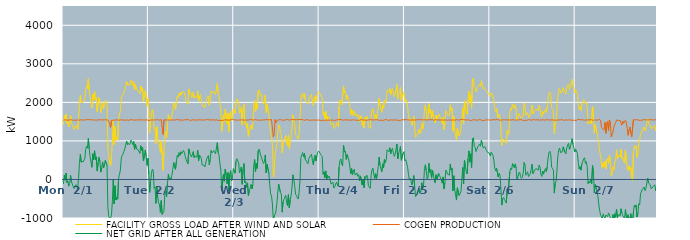
| Category | FACILITY GROSS LOAD AFTER WIND AND SOLAR | COGEN PRODUCTION | NET GRID AFTER ALL GENERATION |
|---|---|---|---|
|  Mon  2/1 | 1423 | 1539 | -116 |
|  Mon  2/1 | 1656 | 1541 | 115 |
|  Mon  2/1 | 1529 | 1548 | -19 |
|  Mon  2/1 | 1698 | 1534 | 164 |
|  Mon  2/1 | 1449 | 1538 | -89 |
|  Mon  2/1 | 1506 | 1548 | -42 |
|  Mon  2/1 | 1362 | 1537 | -175 |
|  Mon  2/1 | 1431 | 1545 | -114 |
|  Mon  2/1 | 1660 | 1553 | 107 |
|  Mon  2/1 | 1482 | 1543 | -61 |
|  Mon  2/1 | 1425 | 1539 | -114 |
|  Mon  2/1 | 1354 | 1541 | -187 |
|  Mon  2/1 | 1300 | 1540 | -240 |
|  Mon  2/1 | 1301 | 1537 | -236 |
|  Mon  2/1 | 1399 | 1534 | -135 |
|  Mon  2/1 | 1354 | 1550 | -196 |
|  Mon  2/1 | 1300 | 1545 | -245 |
|  Mon  2/1 | 1579 | 1550 | 29 |
|  Mon  2/1 | 1955 | 1537 | 418 |
|  Mon  2/1 | 2193 | 1539 | 654 |
|  Mon  2/1 | 1997 | 1550 | 447 |
|  Mon  2/1 | 2011 | 1533 | 478 |
|  Mon  2/1 | 1991 | 1539 | 452 |
|  Mon  2/1 | 1981 | 1546 | 435 |
|  Mon  2/1 | 2083 | 1543 | 540 |
|  Mon  2/1 | 2327 | 1545 | 782 |
|  Mon  2/1 | 2406 | 1551 | 855 |
|  Mon  2/1 | 2356 | 1545 | 811 |
|  Mon  2/1 | 2614 | 1549 | 1065 |
|  Mon  2/1 | 2322 | 1535 | 787 |
|  Mon  2/1 | 2142 | 1554 | 588 |
|  Mon  2/1 | 2133 | 1543 | 590 |
|  Mon  2/1 | 1859 | 1543 | 316 |
|  Mon  2/1 | 2209 | 1542 | 667 |
|  Mon  2/1 | 2059 | 1544 | 515 |
|  Mon  2/1 | 2290 | 1547 | 743 |
|  Mon  2/1 | 2056 | 1541 | 515 |
|  Mon  2/1 | 2131 | 1544 | 587 |
|  Mon  2/1 | 1757 | 1539 | 218 |
|  Mon  2/1 | 1981 | 1550 | 431 |
|  Mon  2/1 | 2125 | 1550 | 575 |
|  Mon  2/1 | 2006 | 1545 | 461 |
|  Mon  2/1 | 1737 | 1547 | 190 |
|  Mon  2/1 | 1839 | 1548 | 291 |
|  Mon  2/1 | 1998 | 1543 | 455 |
|  Mon  2/1 | 1846 | 1548 | 298 |
|  Mon  2/1 | 1910 | 1548 | 362 |
|  Mon  2/1 | 2025 | 1533 | 492 |
|  Mon  2/1 | 2057 | 1546 | 511 |
|  Mon  2/1 | 1897 | 1535 | 362 |
|  Mon  2/1 | 820 | 1544 | -724 |
|  Mon  2/1 | 579 | 1544 | -965 |
|  Mon  2/1 | 422 | 1449 | -1027 |
|  Mon  2/1 | 350 | 1351 | -1001 |
|  Mon  2/1 | 596 | 1529 | -933 |
|  Mon  2/1 | 965 | 1544 | -579 |
|  Mon  2/1 | 1529 | 1539 | -10 |
|  Mon  2/1 | 905 | 1540 | -635 |
|  Mon  2/1 | 1376 | 1537 | -161 |
|  Mon  2/1 | 1016 | 1551 | -535 |
|  Mon  2/1 | 1086 | 1550 | -464 |
|  Mon  2/1 | 1030 | 1543 | -513 |
|  Mon  2/1 | 1564 | 1536 | 28 |
|  Mon  2/1 | 1579 | 1538 | 41 |
|  Mon  2/1 | 1784 | 1546 | 238 |
|  Mon  2/1 | 2079 | 1542 | 537 |
|  Mon  2/1 | 2172 | 1544 | 628 |
|  Mon  2/1 | 2209 | 1548 | 661 |
|  Mon  2/1 | 2263 | 1540 | 723 |
|  Mon  2/1 | 2325 | 1536 | 789 |
|  Mon  2/1 | 2339 | 1537 | 802 |
|  Mon  2/1 | 2542 | 1548 | 994 |
|  Mon  2/1 | 2449 | 1544 | 905 |
|  Mon  2/1 | 2486 | 1544 | 942 |
|  Mon  2/1 | 2433 | 1534 | 899 |
|  Mon  2/1 | 2467 | 1540 | 927 |
|  Mon  2/1 | 2576 | 1555 | 1021 |
|  Mon  2/1 | 2529 | 1561 | 968 |
|  Mon  2/1 | 2445 | 1543 | 902 |
|  Mon  2/1 | 2537 | 1551 | 986 |
|  Mon  2/1 | 2321 | 1539 | 782 |
|  Mon  2/1 | 2461 | 1549 | 912 |
|  Mon  2/1 | 2339 | 1543 | 796 |
|  Mon  2/1 | 2361 | 1543 | 818 |
|  Mon  2/1 | 2317 | 1544 | 773 |
|  Mon  2/1 | 2304 | 1540 | 764 |
|  Mon  2/1 | 2220 | 1547 | 673 |
|  Mon  2/1 | 2426 | 1550 | 876 |
|  Mon  2/1 | 2301 | 1545 | 756 |
|  Mon  2/1 | 2370 | 1542 | 828 |
|  Mon  2/1 | 2022 | 1543 | 479 |
|  Mon  2/1 | 2152 | 1535 | 617 |
|  Mon  2/1 | 2308 | 1542 | 766 |
|  Mon  2/1 | 2137 | 1539 | 598 |
|  Mon  2/1 | 1915 | 1548 | 367 |
|  Mon  2/1 | 2102 | 1554 | 548 |
|  Tue  2/2 | 1662 | 1526 | 136 |
|  Tue  2/2 | 1207 | 1542 | -335 |
|  Tue  2/2 | 1487 | 1540 | -53 |
|  Tue  2/2 | 1704 | 1541 | 163 |
|  Tue  2/2 | 1815 | 1546 | 269 |
|  Tue  2/2 | 1782 | 1549 | 233 |
|  Tue  2/2 | 1309 | 1542 | -233 |
|  Tue  2/2 | 1344 | 1537 | -193 |
|  Tue  2/2 | 924 | 1546 | -622 |
|  Tue  2/2 | 1367 | 1549 | -182 |
|  Tue  2/2 | 1099 | 1551 | -452 |
|  Tue  2/2 | 928 | 1533 | -605 |
|  Tue  2/2 | 897 | 1538 | -641 |
|  Tue  2/2 | 700 | 1551 | -851 |
|  Tue  2/2 | 1004 | 1553 | -549 |
|  Tue  2/2 | 642 | 1550 | -908 |
|  Tue  2/2 | 234 | 1167 | -933 |
|  Tue  2/2 | 722 | 1548 | -826 |
|  Tue  2/2 | 1146 | 1546 | -400 |
|  Tue  2/2 | 1246 | 1542 | -296 |
|  Tue  2/2 | 1089 | 1535 | -446 |
|  Tue  2/2 | 1444 | 1544 | -100 |
|  Tue  2/2 | 1685 | 1548 | 137 |
|  Tue  2/2 | 1544 | 1540 | 4 |
|  Tue  2/2 | 1595 | 1553 | 42 |
|  Tue  2/2 | 1549 | 1545 | 4 |
|  Tue  2/2 | 1664 | 1546 | 118 |
|  Tue  2/2 | 1805 | 1542 | 263 |
|  Tue  2/2 | 1986 | 1550 | 436 |
|  Tue  2/2 | 1959 | 1539 | 420 |
|  Tue  2/2 | 1806 | 1543 | 263 |
|  Tue  2/2 | 2022 | 1553 | 469 |
|  Tue  2/2 | 2166 | 1540 | 626 |
|  Tue  2/2 | 2122 | 1547 | 575 |
|  Tue  2/2 | 2240 | 1546 | 694 |
|  Tue  2/2 | 2166 | 1544 | 622 |
|  Tue  2/2 | 2266 | 1544 | 722 |
|  Tue  2/2 | 2206 | 1539 | 667 |
|  Tue  2/2 | 2196 | 1550 | 646 |
|  Tue  2/2 | 2293 | 1541 | 752 |
|  Tue  2/2 | 2244 | 1544 | 700 |
|  Tue  2/2 | 2149 | 1550 | 599 |
|  Tue  2/2 | 2041 | 1525 | 516 |
|  Tue  2/2 | 2050 | 1550 | 500 |
|  Tue  2/2 | 1952 | 1546 | 406 |
|  Tue  2/2 | 2348 | 1555 | 793 |
|  Tue  2/2 | 2214 | 1529 | 685 |
|  Tue  2/2 | 2254 | 1550 | 704 |
|  Tue  2/2 | 2120 | 1538 | 582 |
|  Tue  2/2 | 2147 | 1540 | 607 |
|  Tue  2/2 | 2269 | 1548 | 721 |
|  Tue  2/2 | 2112 | 1547 | 565 |
|  Tue  2/2 | 2150 | 1541 | 609 |
|  Tue  2/2 | 2144 | 1540 | 604 |
|  Tue  2/2 | 2117 | 1542 | 575 |
|  Tue  2/2 | 2293 | 1537 | 756 |
|  Tue  2/2 | 2033 | 1547 | 486 |
|  Tue  2/2 | 2156 | 1522 | 634 |
|  Tue  2/2 | 2203 | 1547 | 656 |
|  Tue  2/2 | 2092 | 1538 | 554 |
|  Tue  2/2 | 1912 | 1538 | 374 |
|  Tue  2/2 | 1915 | 1544 | 371 |
|  Tue  2/2 | 1911 | 1544 | 367 |
|  Tue  2/2 | 1859 | 1537 | 322 |
|  Tue  2/2 | 1882 | 1545 | 337 |
|  Tue  2/2 | 2077 | 1549 | 528 |
|  Tue  2/2 | 2067 | 1556 | 511 |
|  Tue  2/2 | 2170 | 1549 | 621 |
|  Tue  2/2 | 1922 | 1545 | 377 |
|  Tue  2/2 | 2069 | 1549 | 520 |
|  Tue  2/2 | 2291 | 1541 | 750 |
|  Tue  2/2 | 2244 | 1554 | 690 |
|  Tue  2/2 | 2242 | 1549 | 693 |
|  Tue  2/2 | 2284 | 1537 | 747 |
|  Tue  2/2 | 2239 | 1539 | 700 |
|  Tue  2/2 | 2205 | 1538 | 667 |
|  Tue  2/2 | 2230 | 1548 | 682 |
|  Tue  2/2 | 2494 | 1542 | 952 |
|  Tue  2/2 | 2225 | 1532 | 693 |
|  Tue  2/2 | 2168 | 1538 | 630 |
|  Tue  2/2 | 1942 | 1536 | 406 |
|  Tue  2/2 | 1798 | 1555 | 243 |
|  Tue  2/2 | 1247 | 1530 | -283 |
|  Tue  2/2 | 1260 | 1538 | -278 |
|  Tue  2/2 | 1678 | 1537 | 141 |
|  Tue  2/2 | 1499 | 1545 | -46 |
|  Tue  2/2 | 1820 | 1549 | 271 |
|  Tue  2/2 | 1653 | 1544 | 109 |
|  Tue  2/2 | 1433 | 1544 | -111 |
|  Tue  2/2 | 1720 | 1542 | 178 |
|  Tue  2/2 | 1240 | 1537 | -297 |
|  Tue  2/2 | 1668 | 1536 | 132 |
|  Tue  2/2 | 1771 | 1546 | 225 |
|  Tue  2/2 | 1516 | 1553 | -37 |
|  Tue  2/2 | 1581 | 1560 | 21 |
|  Tue  2/2 | 1822 | 1543 | 279 |
|  Wed  2/3 | 1827 | 1545 | 282 |
|  Wed  2/3 | 1717 | 1553 | 164 |
|  Wed  2/3 | 2010 | 1544 | 466 |
|  Wed  2/3 | 2090 | 1552 | 538 |
|  Wed  2/3 | 2061 | 1537 | 524 |
|  Wed  2/3 | 1977 | 1545 | 432 |
|  Wed  2/3 | 1717 | 1544 | 173 |
|  Wed  2/3 | 1762 | 1550 | 212 |
|  Wed  2/3 | 1872 | 1547 | 325 |
|  Wed  2/3 | 1411 | 1536 | -125 |
|  Wed  2/3 | 1817 | 1544 | 273 |
|  Wed  2/3 | 1959 | 1546 | 413 |
|  Wed  2/3 | 1454 | 1540 | -86 |
|  Wed  2/3 | 1489 | 1544 | -55 |
|  Wed  2/3 | 1336 | 1541 | -205 |
|  Wed  2/3 | 1458 | 1547 | -89 |
|  Wed  2/3 | 1117 | 1541 | -424 |
|  Wed  2/3 | 1244 | 1541 | -297 |
|  Wed  2/3 | 1335 | 1553 | -218 |
|  Wed  2/3 | 1409 | 1541 | -132 |
|  Wed  2/3 | 1303 | 1547 | -244 |
|  Wed  2/3 | 1423 | 1556 | -133 |
|  Wed  2/3 | 1895 | 1540 | 355 |
|  Wed  2/3 | 2054 | 1538 | 516 |
|  Wed  2/3 | 1752 | 1556 | 196 |
|  Wed  2/3 | 1963 | 1548 | 415 |
|  Wed  2/3 | 1826 | 1538 | 288 |
|  Wed  2/3 | 2280 | 1542 | 738 |
|  Wed  2/3 | 2324 | 1538 | 786 |
|  Wed  2/3 | 2347 | 1539 | 808 |
|  Wed  2/3 | 2157 | 1541 | 616 |
|  Wed  2/3 | 2185 | 1552 | 633 |
|  Wed  2/3 | 2016 | 1542 | 474 |
|  Wed  2/3 | 1953 | 1539 | 414 |
|  Wed  2/3 | 2006 | 1547 | 459 |
|  Wed  2/3 | 2186 | 1550 | 636 |
|  Wed  2/3 | 1723 | 1551 | 172 |
|  Wed  2/3 | 1944 | 1550 | 394 |
|  Wed  2/3 | 1948 | 1550 | 398 |
|  Wed  2/3 | 1697 | 1540 | 157 |
|  Wed  2/3 | 1413 | 1546 | -133 |
|  Wed  2/3 | 1163 | 1538 | -375 |
|  Wed  2/3 | 1123 | 1554 | -431 |
|  Wed  2/3 | 903 | 1541 | -638 |
|  Wed  2/3 | 71 | 1107 | -1036 |
|  Wed  2/3 | 232 | 1182 | -950 |
|  Wed  2/3 | 651 | 1553 | -902 |
|  Wed  2/3 | 655 | 1473 | -818 |
|  Wed  2/3 | 907 | 1530 | -623 |
|  Wed  2/3 | 1189 | 1542 | -353 |
|  Wed  2/3 | 1423 | 1543 | -120 |
|  Wed  2/3 | 1394 | 1534 | -140 |
|  Wed  2/3 | 1215 | 1553 | -338 |
|  Wed  2/3 | 1169 | 1547 | -378 |
|  Wed  2/3 | 689 | 1538 | -849 |
|  Wed  2/3 | 966 | 1539 | -573 |
|  Wed  2/3 | 1021 | 1536 | -515 |
|  Wed  2/3 | 1025 | 1531 | -506 |
|  Wed  2/3 | 1136 | 1548 | -412 |
|  Wed  2/3 | 938 | 1538 | -600 |
|  Wed  2/3 | 876 | 1556 | -680 |
|  Wed  2/3 | 1141 | 1535 | -394 |
|  Wed  2/3 | 799 | 1539 | -740 |
|  Wed  2/3 | 1006 | 1539 | -533 |
|  Wed  2/3 | 1138 | 1550 | -412 |
|  Wed  2/3 | 1335 | 1548 | -213 |
|  Wed  2/3 | 1677 | 1556 | 121 |
|  Wed  2/3 | 1573 | 1554 | 19 |
|  Wed  2/3 | 1388 | 1548 | -160 |
|  Wed  2/3 | 1163 | 1540 | -377 |
|  Wed  2/3 | 1134 | 1552 | -418 |
|  Wed  2/3 | 1071 | 1539 | -468 |
|  Wed  2/3 | 1043 | 1551 | -508 |
|  Wed  2/3 | 1204 | 1538 | -334 |
|  Wed  2/3 | 1518 | 1555 | -37 |
|  Wed  2/3 | 2109 | 1542 | 567 |
|  Wed  2/3 | 2190 | 1554 | 636 |
|  Wed  2/3 | 2240 | 1543 | 697 |
|  Wed  2/3 | 2125 | 1543 | 582 |
|  Wed  2/3 | 2230 | 1558 | 672 |
|  Wed  2/3 | 2060 | 1536 | 524 |
|  Wed  2/3 | 2017 | 1540 | 477 |
|  Wed  2/3 | 2034 | 1554 | 480 |
|  Wed  2/3 | 1960 | 1554 | 406 |
|  Wed  2/3 | 2082 | 1537 | 545 |
|  Wed  2/3 | 2132 | 1546 | 586 |
|  Wed  2/3 | 2134 | 1536 | 598 |
|  Wed  2/3 | 2204 | 1551 | 653 |
|  Wed  2/3 | 2029 | 1543 | 486 |
|  Wed  2/3 | 1921 | 1545 | 376 |
|  Wed  2/3 | 2091 | 1541 | 550 |
|  Wed  2/3 | 2169 | 1542 | 627 |
|  Wed  2/3 | 2016 | 1538 | 478 |
|  Wed  2/3 | 2149 | 1537 | 612 |
|  Wed  2/3 | 2248 | 1540 | 708 |
|  Wed  2/3 | 2285 | 1548 | 737 |
|  Thu  2/4 | 2287 | 1541 | 746 |
|  Thu  2/4 | 2208 | 1544 | 664 |
|  Thu  2/4 | 2148 | 1523 | 625 |
|  Thu  2/4 | 2118 | 1521 | 597 |
|  Thu  2/4 | 1676 | 1542 | 134 |
|  Thu  2/4 | 1738 | 1539 | 199 |
|  Thu  2/4 | 1564 | 1519 | 45 |
|  Thu  2/4 | 1767 | 1546 | 221 |
|  Thu  2/4 | 1533 | 1534 | -1 |
|  Thu  2/4 | 1643 | 1533 | 110 |
|  Thu  2/4 | 1598 | 1550 | 48 |
|  Thu  2/4 | 1624 | 1539 | 85 |
|  Thu  2/4 | 1611 | 1539 | 72 |
|  Thu  2/4 | 1418 | 1537 | -119 |
|  Thu  2/4 | 1430 | 1550 | -120 |
|  Thu  2/4 | 1470 | 1541 | -71 |
|  Thu  2/4 | 1321 | 1544 | -223 |
|  Thu  2/4 | 1340 | 1530 | -190 |
|  Thu  2/4 | 1365 | 1545 | -180 |
|  Thu  2/4 | 1473 | 1545 | -72 |
|  Thu  2/4 | 1423 | 1542 | -119 |
|  Thu  2/4 | 1370 | 1548 | -178 |
|  Thu  2/4 | 1887 | 1560 | 327 |
|  Thu  2/4 | 2058 | 1560 | 498 |
|  Thu  2/4 | 2076 | 1544 | 532 |
|  Thu  2/4 | 1933 | 1545 | 388 |
|  Thu  2/4 | 1911 | 1556 | 355 |
|  Thu  2/4 | 2426 | 1542 | 884 |
|  Thu  2/4 | 2257 | 1548 | 709 |
|  Thu  2/4 | 2283 | 1547 | 736 |
|  Thu  2/4 | 2068 | 1550 | 518 |
|  Thu  2/4 | 2186 | 1543 | 643 |
|  Thu  2/4 | 2118 | 1549 | 569 |
|  Thu  2/4 | 2046 | 1544 | 502 |
|  Thu  2/4 | 1898 | 1546 | 352 |
|  Thu  2/4 | 1684 | 1537 | 147 |
|  Thu  2/4 | 1825 | 1544 | 281 |
|  Thu  2/4 | 1662 | 1546 | 116 |
|  Thu  2/4 | 1788 | 1551 | 237 |
|  Thu  2/4 | 1809 | 1544 | 265 |
|  Thu  2/4 | 1652 | 1540 | 112 |
|  Thu  2/4 | 1629 | 1539 | 90 |
|  Thu  2/4 | 1705 | 1537 | 168 |
|  Thu  2/4 | 1614 | 1532 | 82 |
|  Thu  2/4 | 1669 | 1546 | 123 |
|  Thu  2/4 | 1505 | 1536 | -31 |
|  Thu  2/4 | 1630 | 1538 | 92 |
|  Thu  2/4 | 1662 | 1556 | 106 |
|  Thu  2/4 | 1404 | 1549 | -145 |
|  Thu  2/4 | 1550 | 1539 | 11 |
|  Thu  2/4 | 1334 | 1544 | -210 |
|  Thu  2/4 | 1620 | 1543 | 77 |
|  Thu  2/4 | 1564 | 1532 | 32 |
|  Thu  2/4 | 1648 | 1534 | 114 |
|  Thu  2/4 | 1589 | 1533 | 56 |
|  Thu  2/4 | 1380 | 1543 | -163 |
|  Thu  2/4 | 1358 | 1536 | -178 |
|  Thu  2/4 | 1321 | 1552 | -231 |
|  Thu  2/4 | 1655 | 1545 | 110 |
|  Thu  2/4 | 1793 | 1545 | 248 |
|  Thu  2/4 | 1841 | 1544 | 297 |
|  Thu  2/4 | 1681 | 1542 | 139 |
|  Thu  2/4 | 1571 | 1544 | 27 |
|  Thu  2/4 | 1699 | 1551 | 148 |
|  Thu  2/4 | 1556 | 1539 | 17 |
|  Thu  2/4 | 1702 | 1550 | 152 |
|  Thu  2/4 | 1878 | 1551 | 327 |
|  Thu  2/4 | 2112 | 1532 | 580 |
|  Thu  2/4 | 1911 | 1540 | 371 |
|  Thu  2/4 | 1903 | 1541 | 362 |
|  Thu  2/4 | 1743 | 1545 | 198 |
|  Thu  2/4 | 1933 | 1529 | 404 |
|  Thu  2/4 | 1850 | 1543 | 307 |
|  Thu  2/4 | 2063 | 1546 | 517 |
|  Thu  2/4 | 1986 | 1548 | 438 |
|  Thu  2/4 | 2063 | 1556 | 507 |
|  Thu  2/4 | 2310 | 1541 | 769 |
|  Thu  2/4 | 2317 | 1533 | 784 |
|  Thu  2/4 | 2262 | 1541 | 721 |
|  Thu  2/4 | 2363 | 1542 | 821 |
|  Thu  2/4 | 2200 | 1535 | 665 |
|  Thu  2/4 | 2309 | 1545 | 764 |
|  Thu  2/4 | 2358 | 1552 | 806 |
|  Thu  2/4 | 2241 | 1542 | 699 |
|  Thu  2/4 | 2150 | 1550 | 600 |
|  Thu  2/4 | 2181 | 1542 | 639 |
|  Thu  2/4 | 2329 | 1548 | 781 |
|  Thu  2/4 | 2463 | 1542 | 921 |
|  Thu  2/4 | 2082 | 1546 | 536 |
|  Thu  2/4 | 2219 | 1532 | 687 |
|  Thu  2/4 | 2295 | 1538 | 757 |
|  Thu  2/4 | 2388 | 1532 | 856 |
|  Thu  2/4 | 2049 | 1551 | 498 |
|  Thu  2/4 | 2031 | 1552 | 479 |
|  Thu  2/4 | 2227 | 1548 | 679 |
|  Thu  2/4 | 2266 | 1544 | 722 |
|  Fri  2/5 | 2017 | 1537 | 480 |
|  Fri  2/5 | 2072 | 1558 | 514 |
|  Fri  2/5 | 2040 | 1535 | 505 |
|  Fri  2/5 | 1873 | 1543 | 330 |
|  Fri  2/5 | 1679 | 1543 | 136 |
|  Fri  2/5 | 1527 | 1542 | -15 |
|  Fri  2/5 | 1579 | 1553 | 26 |
|  Fri  2/5 | 1487 | 1541 | -54 |
|  Fri  2/5 | 1405 | 1544 | -139 |
|  Fri  2/5 | 1540 | 1544 | -4 |
|  Fri  2/5 | 1643 | 1542 | 101 |
|  Fri  2/5 | 1350 | 1541 | -191 |
|  Fri  2/5 | 1089 | 1534 | -445 |
|  Fri  2/5 | 1087 | 1546 | -459 |
|  Fri  2/5 | 1166 | 1544 | -378 |
|  Fri  2/5 | 1182 | 1551 | -369 |
|  Fri  2/5 | 1305 | 1542 | -237 |
|  Fri  2/5 | 1189 | 1550 | -361 |
|  Fri  2/5 | 1257 | 1551 | -294 |
|  Fri  2/5 | 1465 | 1549 | -84 |
|  Fri  2/5 | 1306 | 1543 | -237 |
|  Fri  2/5 | 1398 | 1546 | -148 |
|  Fri  2/5 | 1852 | 1570 | 282 |
|  Fri  2/5 | 1929 | 1549 | 380 |
|  Fri  2/5 | 1783 | 1554 | 229 |
|  Fri  2/5 | 1551 | 1540 | 11 |
|  Fri  2/5 | 1590 | 1536 | 54 |
|  Fri  2/5 | 1971 | 1551 | 420 |
|  Fri  2/5 | 1726 | 1540 | 186 |
|  Fri  2/5 | 1809 | 1548 | 261 |
|  Fri  2/5 | 1579 | 1543 | 36 |
|  Fri  2/5 | 1798 | 1557 | 241 |
|  Fri  2/5 | 1643 | 1530 | 113 |
|  Fri  2/5 | 1539 | 1545 | -6 |
|  Fri  2/5 | 1465 | 1552 | -87 |
|  Fri  2/5 | 1666 | 1543 | 123 |
|  Fri  2/5 | 1549 | 1546 | 3 |
|  Fri  2/5 | 1526 | 1545 | -19 |
|  Fri  2/5 | 1700 | 1543 | 157 |
|  Fri  2/5 | 1646 | 1545 | 101 |
|  Fri  2/5 | 1634 | 1542 | 92 |
|  Fri  2/5 | 1540 | 1555 | -15 |
|  Fri  2/5 | 1448 | 1545 | -97 |
|  Fri  2/5 | 1611 | 1545 | 66 |
|  Fri  2/5 | 1293 | 1538 | -245 |
|  Fri  2/5 | 1460 | 1544 | -84 |
|  Fri  2/5 | 1791 | 1546 | 245 |
|  Fri  2/5 | 1747 | 1542 | 205 |
|  Fri  2/5 | 1669 | 1533 | 136 |
|  Fri  2/5 | 1677 | 1549 | 128 |
|  Fri  2/5 | 1657 | 1544 | 113 |
|  Fri  2/5 | 1943 | 1541 | 402 |
|  Fri  2/5 | 1779 | 1539 | 240 |
|  Fri  2/5 | 1844 | 1556 | 288 |
|  Fri  2/5 | 1252 | 1546 | -294 |
|  Fri  2/5 | 1632 | 1536 | 96 |
|  Fri  2/5 | 1271 | 1535 | -264 |
|  Fri  2/5 | 1136 | 1546 | -410 |
|  Fri  2/5 | 1020 | 1555 | -535 |
|  Fri  2/5 | 1330 | 1546 | -216 |
|  Fri  2/5 | 1327 | 1538 | -211 |
|  Fri  2/5 | 1133 | 1549 | -416 |
|  Fri  2/5 | 1182 | 1549 | -367 |
|  Fri  2/5 | 1202 | 1526 | -324 |
|  Fri  2/5 | 1531 | 1558 | -27 |
|  Fri  2/5 | 1858 | 1547 | 311 |
|  Fri  2/5 | 1441 | 1557 | -116 |
|  Fri  2/5 | 2043 | 1546 | 497 |
|  Fri  2/5 | 1887 | 1542 | 345 |
|  Fri  2/5 | 1750 | 1544 | 206 |
|  Fri  2/5 | 1690 | 1546 | 144 |
|  Fri  2/5 | 2080 | 1535 | 545 |
|  Fri  2/5 | 2287 | 1545 | 742 |
|  Fri  2/5 | 2003 | 1553 | 450 |
|  Fri  2/5 | 2188 | 1522 | 666 |
|  Fri  2/5 | 1850 | 1540 | 310 |
|  Fri  2/5 | 2598 | 1545 | 1053 |
|  Fri  2/5 | 2626 | 1543 | 1083 |
|  Fri  2/5 | 2410 | 1548 | 862 |
|  Fri  2/5 | 2372 | 1542 | 830 |
|  Fri  2/5 | 2267 | 1541 | 726 |
|  Fri  2/5 | 2290 | 1546 | 744 |
|  Fri  2/5 | 2391 | 1538 | 853 |
|  Fri  2/5 | 2391 | 1549 | 842 |
|  Fri  2/5 | 2467 | 1553 | 914 |
|  Fri  2/5 | 2411 | 1548 | 863 |
|  Fri  2/5 | 2559 | 1541 | 1018 |
|  Fri  2/5 | 2443 | 1538 | 905 |
|  Fri  2/5 | 2349 | 1526 | 823 |
|  Fri  2/5 | 2382 | 1551 | 831 |
|  Fri  2/5 | 2389 | 1540 | 849 |
|  Fri  2/5 | 2319 | 1533 | 786 |
|  Fri  2/5 | 2291 | 1545 | 746 |
|  Fri  2/5 | 2234 | 1533 | 701 |
|  Fri  2/5 | 2226 | 1547 | 679 |
|  Fri  2/5 | 2218 | 1536 | 682 |
|  Sat  2/6 | 2145 | 1536 | 609 |
|  Sat  2/6 | 2249 | 1539 | 710 |
|  Sat  2/6 | 2257 | 1548 | 709 |
|  Sat  2/6 | 2174 | 1548 | 626 |
|  Sat  2/6 | 2052 | 1550 | 502 |
|  Sat  2/6 | 1844 | 1543 | 301 |
|  Sat  2/6 | 1767 | 1546 | 221 |
|  Sat  2/6 | 1841 | 1546 | 295 |
|  Sat  2/6 | 1863 | 1556 | 307 |
|  Sat  2/6 | 1597 | 1535 | 62 |
|  Sat  2/6 | 1693 | 1540 | 153 |
|  Sat  2/6 | 1633 | 1533 | 100 |
|  Sat  2/6 | 1284 | 1538 | -254 |
|  Sat  2/6 | 883 | 1548 | -665 |
|  Sat  2/6 | 1048 | 1547 | -499 |
|  Sat  2/6 | 1067 | 1535 | -468 |
|  Sat  2/6 | 1024 | 1546 | -522 |
|  Sat  2/6 | 976 | 1539 | -563 |
|  Sat  2/6 | 936 | 1547 | -611 |
|  Sat  2/6 | 1281 | 1543 | -262 |
|  Sat  2/6 | 1162 | 1542 | -380 |
|  Sat  2/6 | 1190 | 1550 | -360 |
|  Sat  2/6 | 1748 | 1544 | 204 |
|  Sat  2/6 | 1848 | 1556 | 292 |
|  Sat  2/6 | 1795 | 1540 | 255 |
|  Sat  2/6 | 1959 | 1548 | 411 |
|  Sat  2/6 | 1903 | 1554 | 349 |
|  Sat  2/6 | 1849 | 1545 | 304 |
|  Sat  2/6 | 1938 | 1535 | 403 |
|  Sat  2/6 | 1834 | 1531 | 303 |
|  Sat  2/6 | 1530 | 1544 | -14 |
|  Sat  2/6 | 1611 | 1550 | 61 |
|  Sat  2/6 | 1708 | 1543 | 165 |
|  Sat  2/6 | 1723 | 1531 | 192 |
|  Sat  2/6 | 1630 | 1551 | 79 |
|  Sat  2/6 | 1581 | 1549 | 32 |
|  Sat  2/6 | 1614 | 1551 | 63 |
|  Sat  2/6 | 1685 | 1522 | 163 |
|  Sat  2/6 | 1985 | 1545 | 440 |
|  Sat  2/6 | 1916 | 1534 | 382 |
|  Sat  2/6 | 1663 | 1553 | 110 |
|  Sat  2/6 | 1681 | 1535 | 146 |
|  Sat  2/6 | 1741 | 1542 | 199 |
|  Sat  2/6 | 1625 | 1549 | 76 |
|  Sat  2/6 | 1598 | 1542 | 56 |
|  Sat  2/6 | 1693 | 1544 | 149 |
|  Sat  2/6 | 1809 | 1546 | 263 |
|  Sat  2/6 | 1931 | 1538 | 393 |
|  Sat  2/6 | 1697 | 1545 | 152 |
|  Sat  2/6 | 1701 | 1557 | 144 |
|  Sat  2/6 | 1787 | 1545 | 242 |
|  Sat  2/6 | 1818 | 1541 | 277 |
|  Sat  2/6 | 1807 | 1545 | 262 |
|  Sat  2/6 | 1818 | 1551 | 267 |
|  Sat  2/6 | 1780 | 1541 | 239 |
|  Sat  2/6 | 1916 | 1540 | 376 |
|  Sat  2/6 | 1852 | 1532 | 320 |
|  Sat  2/6 | 1659 | 1542 | 117 |
|  Sat  2/6 | 1615 | 1536 | 79 |
|  Sat  2/6 | 1766 | 1548 | 218 |
|  Sat  2/6 | 1701 | 1562 | 139 |
|  Sat  2/6 | 1762 | 1539 | 223 |
|  Sat  2/6 | 1817 | 1537 | 280 |
|  Sat  2/6 | 1743 | 1547 | 196 |
|  Sat  2/6 | 1875 | 1542 | 333 |
|  Sat  2/6 | 2095 | 1550 | 545 |
|  Sat  2/6 | 2239 | 1540 | 699 |
|  Sat  2/6 | 2271 | 1540 | 731 |
|  Sat  2/6 | 2183 | 1535 | 648 |
|  Sat  2/6 | 1867 | 1547 | 320 |
|  Sat  2/6 | 1855 | 1549 | 306 |
|  Sat  2/6 | 1791 | 1541 | 250 |
|  Sat  2/6 | 1186 | 1540 | -354 |
|  Sat  2/6 | 1438 | 1536 | -98 |
|  Sat  2/6 | 1501 | 1548 | -47 |
|  Sat  2/6 | 1785 | 1539 | 246 |
|  Sat  2/6 | 2147 | 1545 | 602 |
|  Sat  2/6 | 2311 | 1543 | 768 |
|  Sat  2/6 | 2365 | 1549 | 816 |
|  Sat  2/6 | 2247 | 1548 | 699 |
|  Sat  2/6 | 2255 | 1550 | 705 |
|  Sat  2/6 | 2265 | 1548 | 717 |
|  Sat  2/6 | 2383 | 1537 | 846 |
|  Sat  2/6 | 2397 | 1533 | 864 |
|  Sat  2/6 | 2254 | 1550 | 704 |
|  Sat  2/6 | 2212 | 1549 | 663 |
|  Sat  2/6 | 2360 | 1543 | 817 |
|  Sat  2/6 | 2431 | 1538 | 893 |
|  Sat  2/6 | 2480 | 1542 | 938 |
|  Sat  2/6 | 2333 | 1549 | 784 |
|  Sat  2/6 | 2387 | 1535 | 852 |
|  Sat  2/6 | 2473 | 1536 | 937 |
|  Sat  2/6 | 2594 | 1536 | 1058 |
|  Sat  2/6 | 2451 | 1537 | 914 |
|  Sat  2/6 | 2377 | 1548 | 829 |
|  Sat  2/6 | 2246 | 1534 | 712 |
|  Sun  2/7 | 2323 | 1537 | 786 |
|  Sun  2/7 | 2331 | 1529 | 802 |
|  Sun  2/7 | 2230 | 1558 | 672 |
|  Sun  2/7 | 1984 | 1543 | 441 |
|  Sun  2/7 | 1821 | 1552 | 269 |
|  Sun  2/7 | 1885 | 1550 | 335 |
|  Sun  2/7 | 1789 | 1549 | 240 |
|  Sun  2/7 | 1953 | 1550 | 403 |
|  Sun  2/7 | 1964 | 1547 | 417 |
|  Sun  2/7 | 2074 | 1545 | 529 |
|  Sun  2/7 | 2099 | 1536 | 563 |
|  Sun  2/7 | 1963 | 1546 | 417 |
|  Sun  2/7 | 2003 | 1542 | 461 |
|  Sun  2/7 | 1860 | 1542 | 318 |
|  Sun  2/7 | 1440 | 1547 | -107 |
|  Sun  2/7 | 1487 | 1541 | -54 |
|  Sun  2/7 | 1455 | 1545 | -90 |
|  Sun  2/7 | 1562 | 1558 | 4 |
|  Sun  2/7 | 1437 | 1551 | -114 |
|  Sun  2/7 | 1905 | 1545 | 360 |
|  Sun  2/7 | 1720 | 1529 | 191 |
|  Sun  2/7 | 1201 | 1547 | -346 |
|  Sun  2/7 | 1422 | 1551 | -129 |
|  Sun  2/7 | 1397 | 1555 | -158 |
|  Sun  2/7 | 1196 | 1530 | -334 |
|  Sun  2/7 | 1105 | 1530 | -425 |
|  Sun  2/7 | 914 | 1558 | -644 |
|  Sun  2/7 | 737 | 1547 | -810 |
|  Sun  2/7 | 623 | 1539 | -916 |
|  Sun  2/7 | 427 | 1356 | -929 |
|  Sun  2/7 | 296 | 1315 | -1019 |
|  Sun  2/7 | 431 | 1324 | -893 |
|  Sun  2/7 | 325 | 1282 | -957 |
|  Sun  2/7 | 474 | 1483 | -1009 |
|  Sun  2/7 | 274 | 1197 | -923 |
|  Sun  2/7 | 502 | 1448 | -946 |
|  Sun  2/7 | 546 | 1512 | -966 |
|  Sun  2/7 | 401 | 1270 | -869 |
|  Sun  2/7 | 626 | 1543 | -917 |
|  Sun  2/7 | 499 | 1500 | -1001 |
|  Sun  2/7 | 92 | 1106 | -1014 |
|  Sun  2/7 | 136 | 1171 | -1035 |
|  Sun  2/7 | 316 | 1228 | -912 |
|  Sun  2/7 | 254 | 1365 | -1111 |
|  Sun  2/7 | 449 | 1341 | -892 |
|  Sun  2/7 | 491 | 1471 | -980 |
|  Sun  2/7 | 767 | 1545 | -778 |
|  Sun  2/7 | 539 | 1530 | -991 |
|  Sun  2/7 | 579 | 1528 | -949 |
|  Sun  2/7 | 634 | 1537 | -903 |
|  Sun  2/7 | 589 | 1532 | -943 |
|  Sun  2/7 | 788 | 1548 | -760 |
|  Sun  2/7 | 539 | 1408 | -869 |
|  Sun  2/7 | 577 | 1517 | -940 |
|  Sun  2/7 | 474 | 1452 | -978 |
|  Sun  2/7 | 419 | 1442 | -1023 |
|  Sun  2/7 | 757 | 1538 | -781 |
|  Sun  2/7 | 508 | 1487 | -979 |
|  Sun  2/7 | 278 | 1329 | -1051 |
|  Sun  2/7 | 229 | 1145 | -916 |
|  Sun  2/7 | 355 | 1282 | -927 |
|  Sun  2/7 | 252 | 1361 | -1109 |
|  Sun  2/7 | 312 | 1201 | -889 |
|  Sun  2/7 | 61 | 1102 | -1041 |
|  Sun  2/7 | -42 | 1114 | -1156 |
|  Sun  2/7 | 703 | 1552 | -849 |
|  Sun  2/7 | 877 | 1546 | -669 |
|  Sun  2/7 | 825 | 1545 | -720 |
|  Sun  2/7 | 874 | 1535 | -661 |
|  Sun  2/7 | 577 | 1552 | -975 |
|  Sun  2/7 | 652 | 1540 | -888 |
|  Sun  2/7 | 908 | 1535 | -627 |
|  Sun  2/7 | 887 | 1545 | -658 |
|  Sun  2/7 | 1164 | 1534 | -370 |
|  Sun  2/7 | 1187 | 1555 | -368 |
|  Sun  2/7 | 1284 | 1539 | -255 |
|  Sun  2/7 | 1280 | 1560 | -280 |
|  Sun  2/7 | 1361 | 1556 | -195 |
|  Sun  2/7 | 1253 | 1543 | -290 |
|  Sun  2/7 | 1311 | 1543 | -232 |
|  Sun  2/7 | 1310 | 1538 | -228 |
|  Sun  2/7 | 1578 | 1548 | 30 |
|  Sun  2/7 | 1467 | 1555 | -88 |
|  Sun  2/7 | 1430 | 1545 | -115 |
|  Sun  2/7 | 1391 | 1543 | -152 |
|  Sun  2/7 | 1311 | 1554 | -243 |
|  Sun  2/7 | 1320 | 1537 | -217 |
|  Sun  2/7 | 1352 | 1538 | -186 |
|  Sun  2/7 | 1372 | 1535 | -163 |
|  Sun  2/7 | 1410 | 1549 | -139 |
|  Sun  2/7 | 1258 | 1552 | -294 |
|  Sun  2/7 | 1374 | 1546 | -172 |